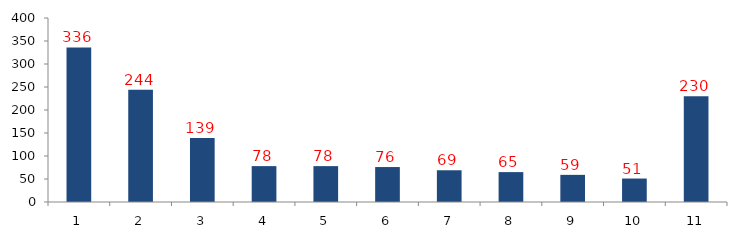
| Category | Numar |
|---|---|
| 0 | 336 |
| 1 | 244 |
| 2 | 139 |
| 3 | 78 |
| 4 | 78 |
| 5 | 76 |
| 6 | 69 |
| 7 | 65 |
| 8 | 59 |
| 9 | 51 |
| 10 | 230 |